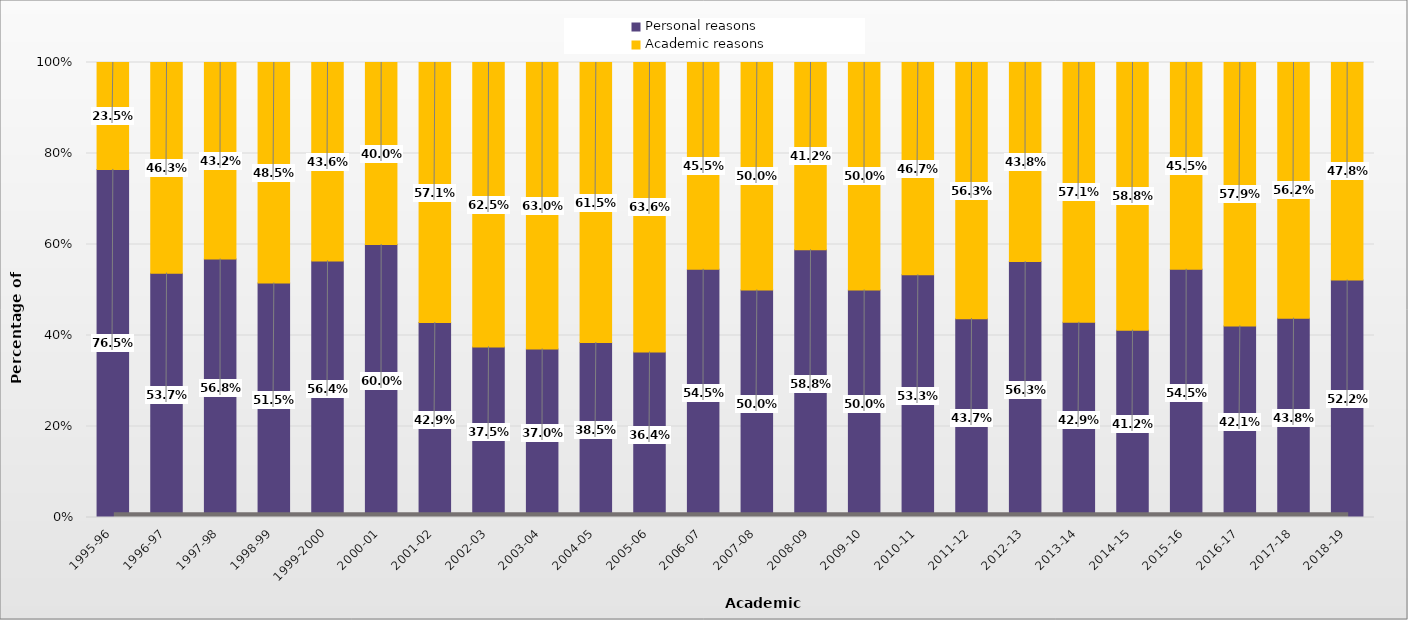
| Category | Personal reasons | Academic reasons |
|---|---|---|
| 1995-96 | 0.765 | 0.235 |
| 1996-97 | 0.537 | 0.463 |
| 1997-98 | 0.568 | 0.432 |
| 1998-99 | 0.515 | 0.485 |
| 1999-2000 | 0.564 | 0.436 |
| 2000-01 | 0.6 | 0.4 |
| 2001-02 | 0.429 | 0.571 |
| 2002-03 | 0.375 | 0.625 |
| 2003-04 | 0.37 | 0.63 |
| 2004-05 | 0.385 | 0.615 |
| 2005-06 | 0.364 | 0.636 |
| 2006-07 | 0.545 | 0.455 |
| 2007-08 | 0.5 | 0.5 |
| 2008-09 | 0.588 | 0.412 |
| 2009-10 | 0.5 | 0.5 |
| 2010-11 | 0.533 | 0.467 |
| 2011-12 | 0.437 | 0.563 |
| 2012-13 | 0.562 | 0.437 |
| 2013-14 | 0.429 | 0.571 |
| 2014-15 | 0.412 | 0.588 |
| 2015-16 | 0.545 | 0.455 |
| 2016-17 | 0.421 | 0.579 |
| 2017-18 | 0.438 | 0.562 |
| 2018-19 | 0.522 | 0.478 |